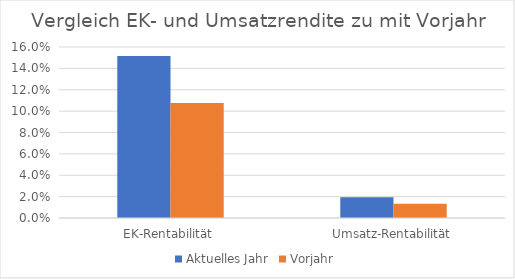
| Category | Aktuelles Jahr | Vorjahr |
|---|---|---|
| EK-Rentabilität | 0.151 | 0.108 |
| Umsatz-Rentabilität | 0.019 | 0.013 |